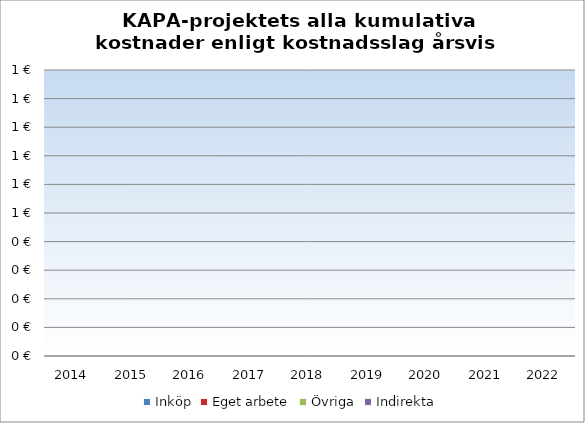
| Category | Inköp | Eget arbete | Övriga | Indirekta |
|---|---|---|---|---|
| 2014.0 | 0 | 0 | 0 | 0 |
| 2015.0 | 0 | 0 | 0 | 0 |
| 2016.0 | 0 | 0 | 0 | 0 |
| 2017.0 | 0 | 0 | 0 | 0 |
| 2018.0 | 0 | 0 | 0 | 0 |
| 2019.0 | 0 | 0 | 0 | 0 |
| 2020.0 | 0 | 0 | 0 | 0 |
| 2021.0 | 0 | 0 | 0 | 0 |
| 2022.0 | 0 | 0 | 0 | 0 |